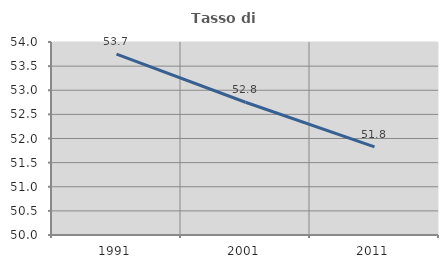
| Category | Tasso di occupazione   |
|---|---|
| 1991.0 | 53.748 |
| 2001.0 | 52.751 |
| 2011.0 | 51.826 |